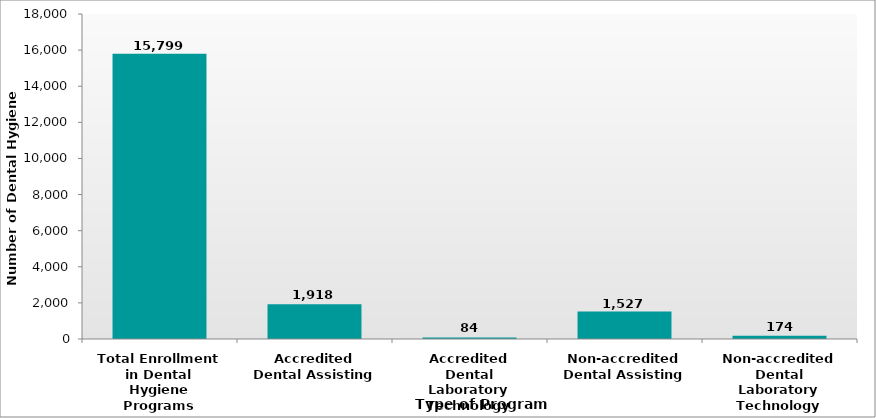
| Category | Number of Dental Hygiene Students |
|---|---|
| Total Enrollment in Dental Hygiene Programs | 15799 |
| Accredited Dental Assisting | 1918 |
| Accredited Dental Laboratory Technology | 84 |
| Non-accredited Dental Assisting | 1527 |
| Non-accredited Dental Laboratory Technology | 174 |